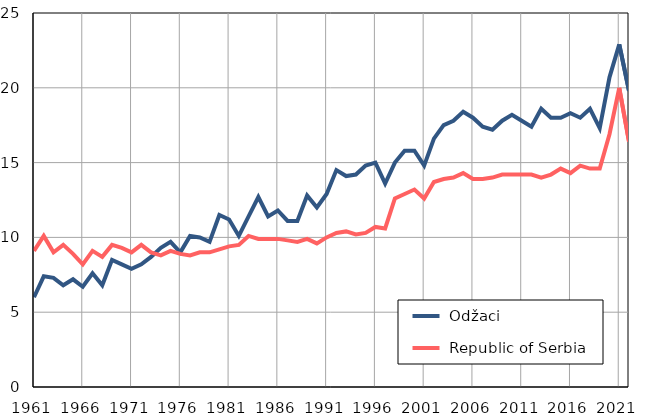
| Category |  Odžaci |  Republic of Serbia |
|---|---|---|
| 1961.0 | 6 | 9.1 |
| 1962.0 | 7.4 | 10.1 |
| 1963.0 | 7.3 | 9 |
| 1964.0 | 6.8 | 9.5 |
| 1965.0 | 7.2 | 8.9 |
| 1966.0 | 6.7 | 8.2 |
| 1967.0 | 7.6 | 9.1 |
| 1968.0 | 6.8 | 8.7 |
| 1969.0 | 8.5 | 9.5 |
| 1970.0 | 8.2 | 9.3 |
| 1971.0 | 7.9 | 9 |
| 1972.0 | 8.2 | 9.5 |
| 1973.0 | 8.7 | 9 |
| 1974.0 | 9.3 | 8.8 |
| 1975.0 | 9.7 | 9.1 |
| 1976.0 | 9 | 8.9 |
| 1977.0 | 10.1 | 8.8 |
| 1978.0 | 10 | 9 |
| 1979.0 | 9.7 | 9 |
| 1980.0 | 11.5 | 9.2 |
| 1981.0 | 11.2 | 9.4 |
| 1982.0 | 10.1 | 9.5 |
| 1983.0 | 11.4 | 10.1 |
| 1984.0 | 12.7 | 9.9 |
| 1985.0 | 11.4 | 9.9 |
| 1986.0 | 11.8 | 9.9 |
| 1987.0 | 11.1 | 9.8 |
| 1988.0 | 11.1 | 9.7 |
| 1989.0 | 12.8 | 9.9 |
| 1990.0 | 12 | 9.6 |
| 1991.0 | 12.9 | 10 |
| 1992.0 | 14.5 | 10.3 |
| 1993.0 | 14.1 | 10.4 |
| 1994.0 | 14.2 | 10.2 |
| 1995.0 | 14.8 | 10.3 |
| 1996.0 | 15 | 10.7 |
| 1997.0 | 13.6 | 10.6 |
| 1998.0 | 15 | 12.6 |
| 1999.0 | 15.8 | 12.9 |
| 2000.0 | 15.8 | 13.2 |
| 2001.0 | 14.8 | 12.6 |
| 2002.0 | 16.6 | 13.7 |
| 2003.0 | 17.5 | 13.9 |
| 2004.0 | 17.8 | 14 |
| 2005.0 | 18.4 | 14.3 |
| 2006.0 | 18 | 13.9 |
| 2007.0 | 17.4 | 13.9 |
| 2008.0 | 17.2 | 14 |
| 2009.0 | 17.8 | 14.2 |
| 2010.0 | 18.2 | 14.2 |
| 2011.0 | 17.8 | 14.2 |
| 2012.0 | 17.4 | 14.2 |
| 2013.0 | 18.6 | 14 |
| 2014.0 | 18 | 14.2 |
| 2015.0 | 18 | 14.6 |
| 2016.0 | 18.3 | 14.3 |
| 2017.0 | 18 | 14.8 |
| 2018.0 | 18.6 | 14.6 |
| 2019.0 | 17.3 | 14.6 |
| 2020.0 | 20.7 | 16.9 |
| 2021.0 | 22.9 | 20 |
| 2022.0 | 19.8 | 16.4 |